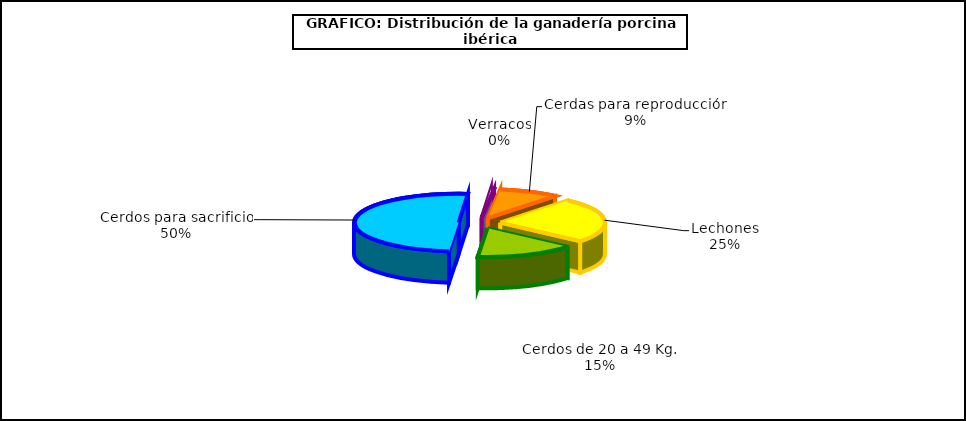
| Category | año 2014 |
|---|---|
| 0 | 777862.022 |
| 1 | 475798.134 |
| 2 | 1551623.93 |
| 3 | 15112.617 |
| 4 | 286370.761 |